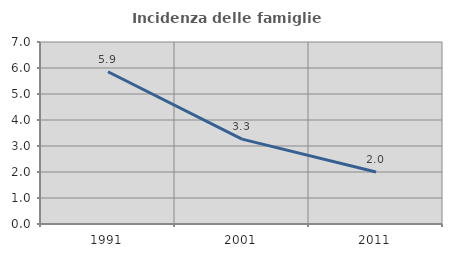
| Category | Incidenza delle famiglie numerose |
|---|---|
| 1991.0 | 5.856 |
| 2001.0 | 3.264 |
| 2011.0 | 1.998 |